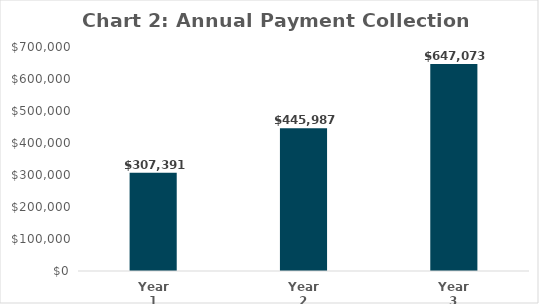
| Category | Series 0 |
|---|---|
| Year 1 | 307391.199 |
| Year 2 | 445987.017 |
| Year 3 | 647072.591 |